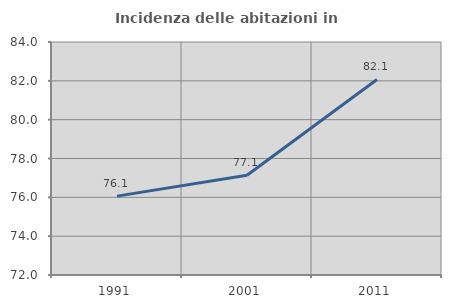
| Category | Incidenza delle abitazioni in proprietà  |
|---|---|
| 1991.0 | 76.062 |
| 2001.0 | 77.135 |
| 2011.0 | 82.071 |